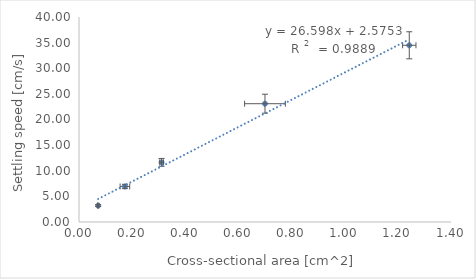
| Category | Series 0 |
|---|---|
| 0.0721066199833563 | 3.2 |
| 0.172756965419066 | 6.93 |
| 0.31073571476473 | 11.64 |
| 0.699896577737348 | 23.08 |
| 1.242942859058919 | 34.48 |